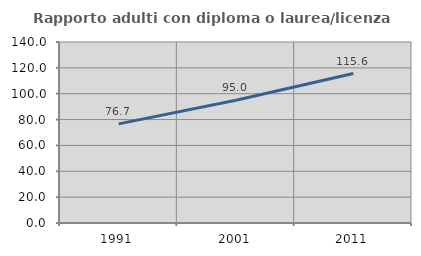
| Category | Rapporto adulti con diploma o laurea/licenza media  |
|---|---|
| 1991.0 | 76.667 |
| 2001.0 | 94.983 |
| 2011.0 | 115.625 |